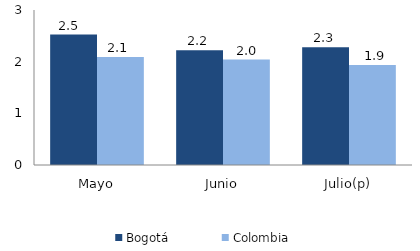
| Category | Bogotá | Colombia |
|---|---|---|
| Mayo | 2.526 | 2.089 |
| Junio | 2.221 | 2.041 |
| Julio(p) | 2.281 | 1.934 |